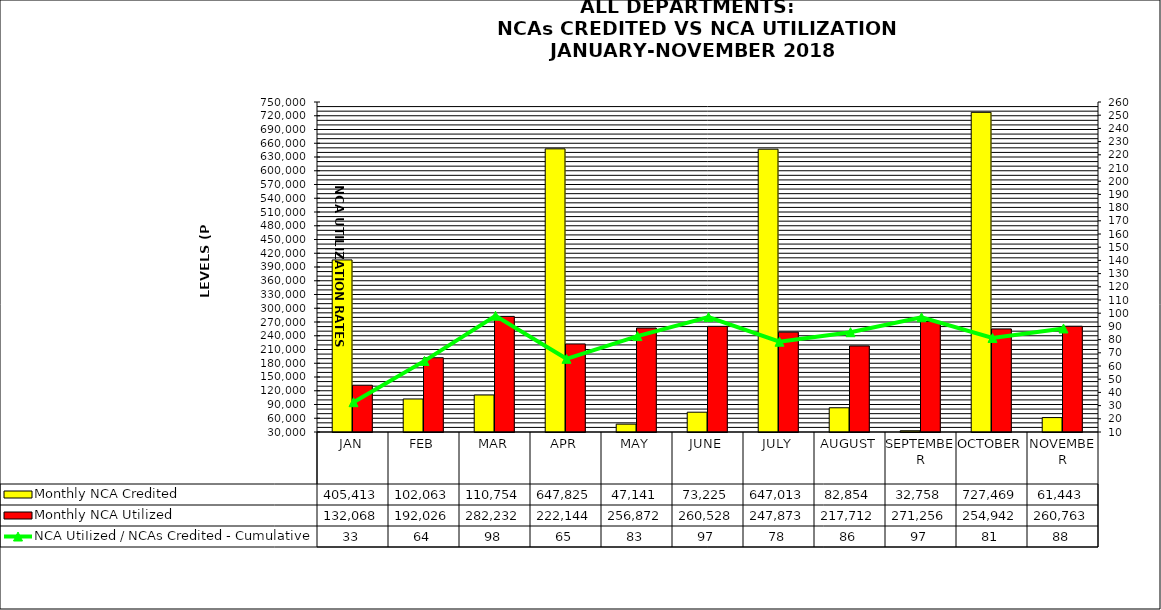
| Category | Monthly NCA Credited | Monthly NCA Utilized |
|---|---|---|
| JAN | 405412.649 | 132068.245 |
| FEB | 102062.543 | 192025.548 |
| MAR | 110753.783 | 282231.938 |
| APR | 647825.13 | 222143.948 |
| MAY | 47140.568 | 256871.588 |
| JUNE | 73225.116 | 260527.957 |
| JULY | 647013.219 | 247872.989 |
| AUGUST | 82854.064 | 217712.435 |
| SEPTEMBER | 32758.461 | 271255.823 |
| OCTOBER | 727468.965 | 254941.984 |
| NOVEMBER | 61443.027 | 260762.751 |